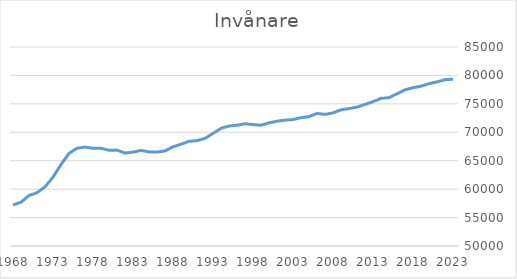
| Category | Series 0 |
|---|---|
| 2023.0 | 79352 |
| 2022.0 | 79244 |
| 2021.0 | 78867 |
| 2020.0 | 78549 |
| 2019.0 | 78105 |
| 2018.0 | 77832 |
| 2017.0 | 77470 |
| 2016.0 | 76770 |
| 2015.0 | 76088 |
| 2014.0 | 75966 |
| 2013.0 | 75383 |
| 2012.0 | 74905 |
| 2011.0 | 74426 |
| 2010.0 | 74178 |
| 2009.0 | 73950 |
| 2008.0 | 73406 |
| 2007.0 | 73146 |
| 2006.0 | 73313 |
| 2005.0 | 72751 |
| 2004.0 | 72565 |
| 2003.0 | 72237 |
| 2002.0 | 72139 |
| 2001.0 | 71952 |
| 2000.0 | 71652 |
| 1999.0 | 71251 |
| 1998.0 | 71360 |
| 1997.0 | 71491 |
| 1996.0 | 71238 |
| 1995.0 | 71106 |
| 1994.0 | 70694 |
| 1993.0 | 69794 |
| 1992.0 | 68924 |
| 1991.0 | 68523 |
| 1990.0 | 68412 |
| 1989.0 | 67903 |
| 1988.0 | 67443 |
| 1987.0 | 66719 |
| 1986.0 | 66526 |
| 1985.0 | 66557 |
| 1984.0 | 66811 |
| 1983.0 | 66512 |
| 1982.0 | 66354 |
| 1981.0 | 66869 |
| 1980.0 | 66834 |
| 1979.0 | 67190 |
| 1978.0 | 67180 |
| 1977.0 | 67405 |
| 1976.0 | 67190 |
| 1975.0 | 66290 |
| 1974.0 | 64322 |
| 1973.0 | 62119 |
| 1972.0 | 60396 |
| 1971.0 | 59377 |
| 1970.0 | 58878 |
| 1969.0 | 57705 |
| 1968.0 | 57220 |